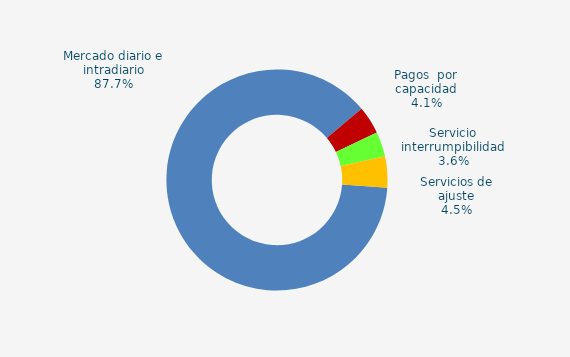
| Category | Series 0 |
|---|---|
| Mercado diario e intradiario | 48.03 |
| Pagos  por capacidad | 2.23 |
| Servicio interrumpibilidad | 1.99 |
| Servicios de ajuste | 2.49 |